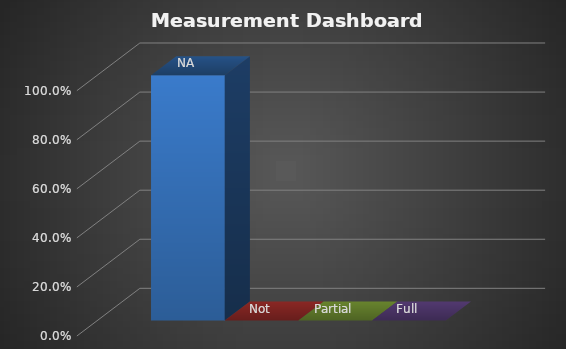
| Category | Series 0 | Series 1 | Series 2 | Series 3 |
|---|---|---|---|---|
| 0 | 1 | 0 | 0 | 0 |